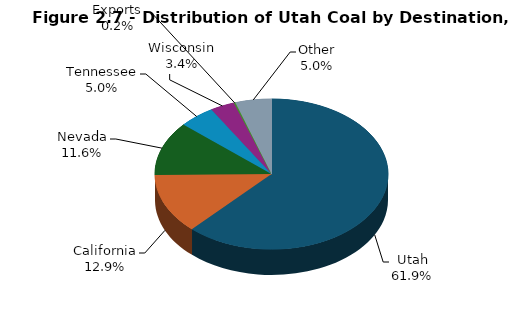
| Category | Series 0 |
|---|---|
| Utah | 15186 |
| California | 3153 |
| Nevada | 2848 |
| Tennessee | 1224 |
| Wisconsin | 825 |
| Exports | 55 |
| Other | 1228 |